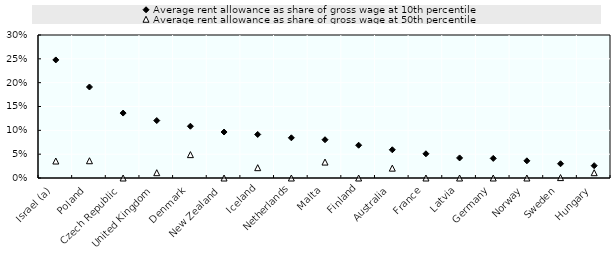
| Category | Average rent allowance as share of gross wage at 10th percentile | Average rent allowance as share of gross wage at 50th percentile |
|---|---|---|
| Israel (a) | 0.248 | 0.036 |
| Poland | 0.191 | 0.036 |
| Czech Republic | 0.136 | 0 |
| United Kingdom | 0.121 | 0.011 |
| Denmark | 0.109 | 0.049 |
| New Zealand | 0.096 | 0 |
| Iceland | 0.091 | 0.022 |
| Netherlands | 0.084 | 0 |
| Malta | 0.08 | 0.033 |
| Finland | 0.069 | 0 |
| Australia | 0.059 | 0.021 |
| France | 0.051 | 0 |
| Latvia | 0.042 | 0 |
| Germany | 0.041 | 0 |
| Norway | 0.036 | 0 |
| Sweden | 0.03 | 0.001 |
| Hungary | 0.026 | 0.011 |